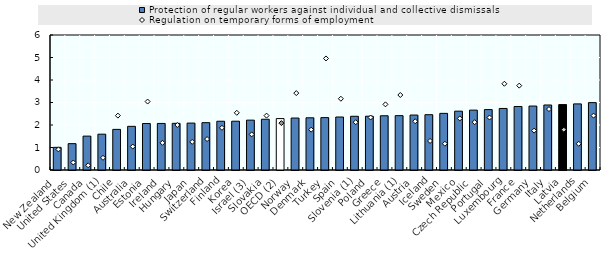
| Category | Protection of regular workers against individual and collective dismissals |
|---|---|
| New Zealand | 1.007 |
| United States | 1.171 |
| Canada | 1.506 |
| United Kingdom (1) | 1.592 |
| Chile | 1.805 |
| Australia | 1.94 |
| Estonia | 2.066 |
| Ireland | 2.069 |
| Hungary | 2.074 |
| Japan | 2.085 |
| Switzerland | 2.104 |
| Finland | 2.167 |
| Korea | 2.168 |
| Israel (3) | 2.216 |
| Slovakia | 2.256 |
| OECD (2) | 2.285 |
| Norway | 2.31 |
| Denmark | 2.32 |
| Turkey | 2.328 |
| Spain | 2.355 |
| Slovenia (1) | 2.387 |
| Poland | 2.391 |
| Greece | 2.41 |
| Lithuania (1) | 2.416 |
| Austria | 2.442 |
| Iceland | 2.458 |
| Sweden | 2.517 |
| Mexico | 2.615 |
| Czech Republic | 2.66 |
| Portugal | 2.685 |
| Luxembourg | 2.735 |
| France | 2.823 |
| Germany | 2.842 |
| Italy | 2.889 |
| Latvia | 2.907 |
| Netherlands | 2.938 |
| Belgium | 2.995 |